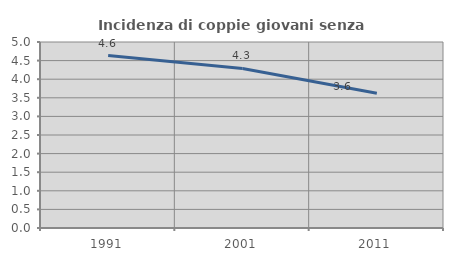
| Category | Incidenza di coppie giovani senza figli |
|---|---|
| 1991.0 | 4.635 |
| 2001.0 | 4.288 |
| 2011.0 | 3.62 |